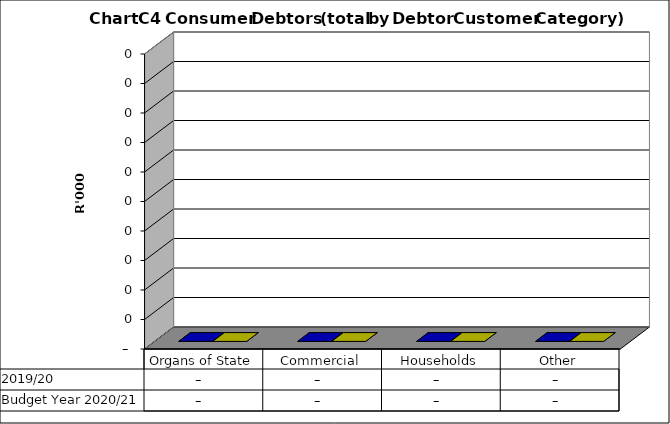
| Category |  2019/20  | Budget Year 2020/21 |
|---|---|---|
| Organs of State | 0 | 0 |
| Commercial | 0 | 0 |
| Households | 0 | 0 |
| Other | 0 | 0 |